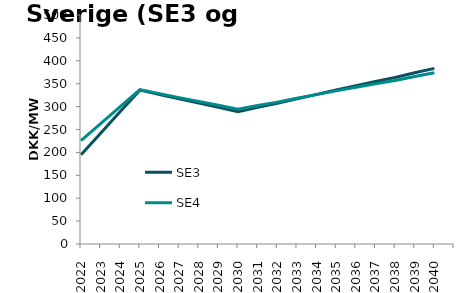
| Category | SE3 | SE4 |
|---|---|---|
| 2022.0 | 194.857 | 225.915 |
| 2023.0 | 241.912 | 262.921 |
| 2024.0 | 289.086 | 300.048 |
| 2025.0 | 335.992 | 336.9 |
| 2026.0 | 326.517 | 328.347 |
| 2027.0 | 316.835 | 319.587 |
| 2028.0 | 307.79 | 311.452 |
| 2029.0 | 298.265 | 302.857 |
| 2030.0 | 288.825 | 294.338 |
| 2031.0 | 298.275 | 302.262 |
| 2032.0 | 307.286 | 309.738 |
| 2033.0 | 317.196 | 318.132 |
| 2034.0 | 326.692 | 326.104 |
| 2035.0 | 336.388 | 334.281 |
| 2036.0 | 345.73 | 342.101 |
| 2037.0 | 354.923 | 349.763 |
| 2038.0 | 363.731 | 357.046 |
| 2039.0 | 373.895 | 365.688 |
| 2040.0 | 383.498 | 373.791 |